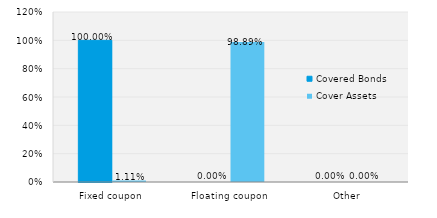
| Category | Covered Bonds | Cover Assets |
|---|---|---|
| Fixed coupon | 1 | 0.011 |
| Floating coupon | 0 | 0.989 |
| Other | 0 | 0 |